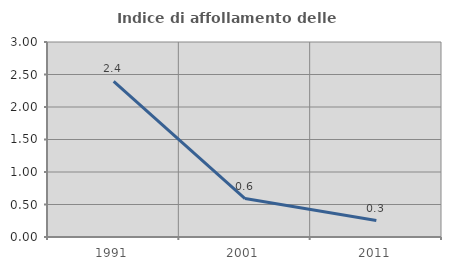
| Category | Indice di affollamento delle abitazioni  |
|---|---|
| 1991.0 | 2.394 |
| 2001.0 | 0.592 |
| 2011.0 | 0.253 |